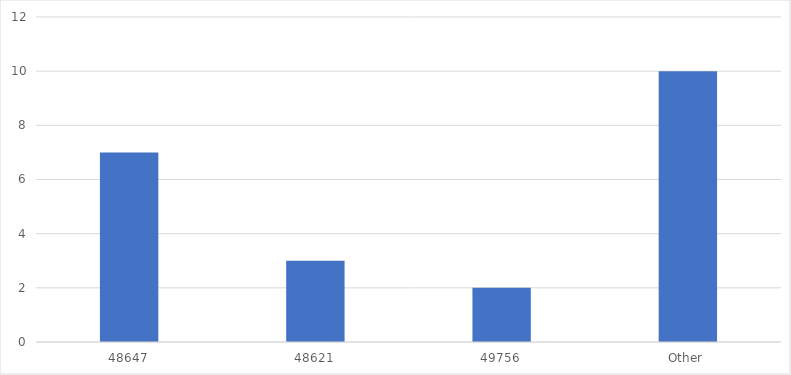
| Category | Number of Responses |
|---|---|
| 48647 | 7 |
| 48621 | 3 |
| 49756 | 2 |
| Other | 10 |